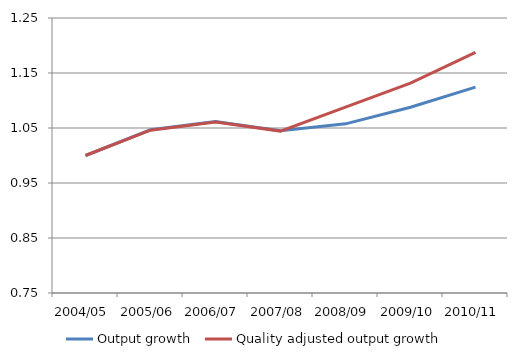
| Category | Output growth | Quality adjusted output growth |
|---|---|---|
| 2004/05 | 1 | 1 |
| 2005/06 | 1.047 | 1.046 |
| 2006/07 | 1.062 | 1.061 |
| 2007/08 | 1.045 | 1.044 |
| 2008/09 | 1.058 | 1.088 |
| 2009/10 | 1.088 | 1.132 |
| 2010/11 | 1.124 | 1.188 |